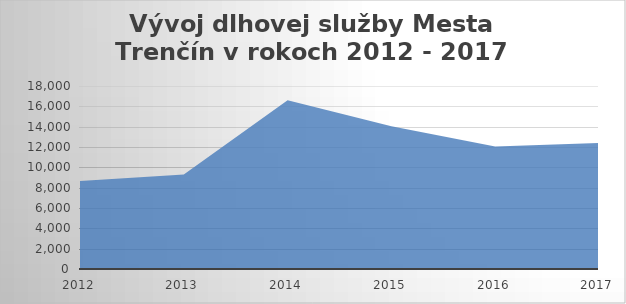
| Category | 2012 |
|---|---|
| 2012.0 | 8649 |
| 2013.0 | 9293 |
| 2014.0 | 16598 |
| 2015.0 | 14037 |
| 2016.0 | 12053 |
| 2017.0 | 12394 |